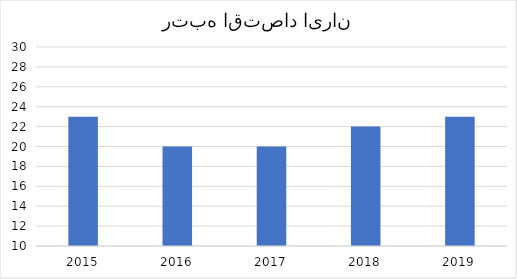
| Category | رتبه اقتصاد ایران |
|---|---|
| 2015.0 | 23 |
| 2016.0 | 20 |
| 2017.0 | 20 |
| 2018.0 | 22 |
| 2019.0 | 23 |